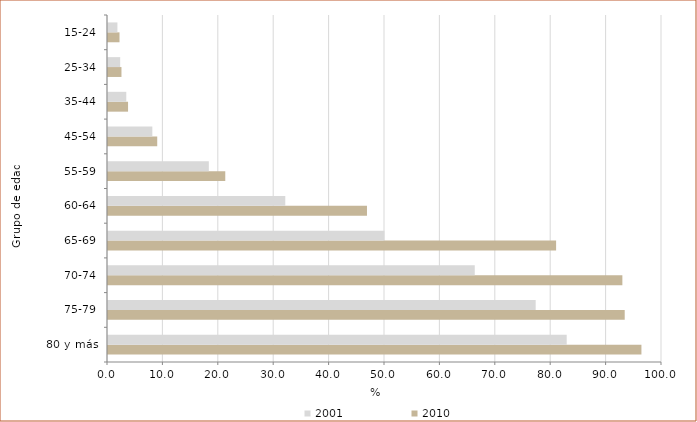
| Category | 2010 | 2001 |
|---|---|---|
| 80 y más | 96.286 | 82.8 |
| 75-79 | 93.268 | 77.2 |
| 70-74 | 92.845 | 66.2 |
| 65-69 | 80.884 | 49.9 |
| 60-64 | 46.749 | 32 |
| 55-59 | 21.168 | 18.2 |
| 45-54 | 8.885 | 8 |
| 35-44 | 3.619 | 3.3 |
| 25-34 | 2.43 | 2.2 |
| 15-24 | 2.077 | 1.7 |